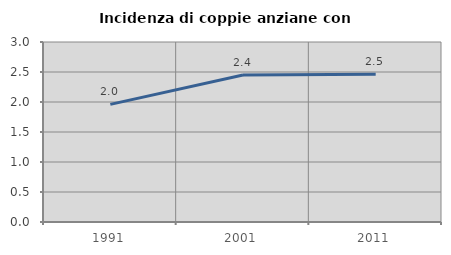
| Category | Incidenza di coppie anziane con figli |
|---|---|
| 1991.0 | 1.961 |
| 2001.0 | 2.449 |
| 2011.0 | 2.46 |